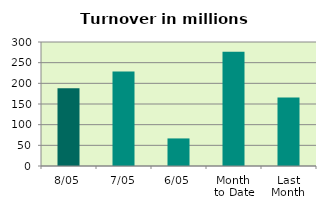
| Category | Series 0 |
|---|---|
| 8/05 | 188.008 |
| 7/05 | 228.722 |
| 6/05 | 66.709 |
| Month 
to Date | 276.158 |
| Last
Month | 165.638 |